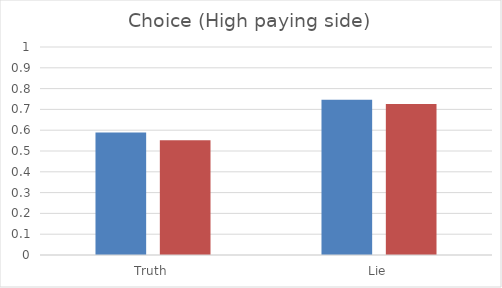
| Category | DI | NDI |
|---|---|---|
| Truth | 0.589 | 0.552 |
| Lie | 0.746 | 0.726 |